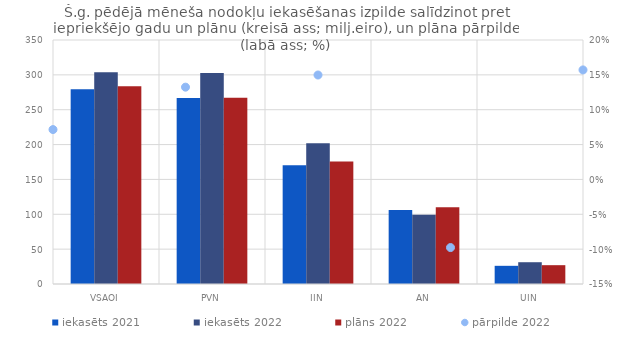
| Category | iekasēts 2021 | iekasēts 2022 | plāns 2022 |
|---|---|---|---|
| VSAOI | 279.485 | 303.844 | 283.567 |
| PVN | 266.644 | 302.725 | 267.341 |
| IIN | 170.505 | 202.017 | 175.7 |
| AN | 106.115 | 99.32 | 110.076 |
| UIN | 26.08 | 31.241 | 27 |